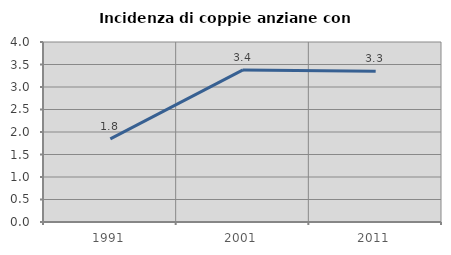
| Category | Incidenza di coppie anziane con figli |
|---|---|
| 1991.0 | 1.849 |
| 2001.0 | 3.379 |
| 2011.0 | 3.347 |